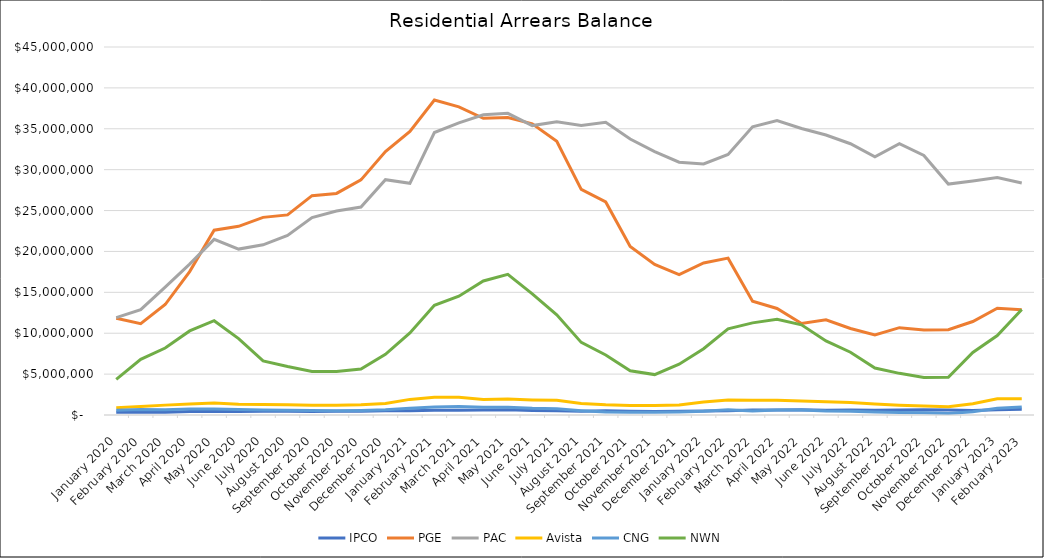
| Category | IPCO | PGE | PAC | Avista | CNG | NWN |
|---|---|---|---|---|---|---|
| 2020-01-01 | 337562.73 | 11838957.17 | 11909155.26 | 879848.87 | 565904.4 | 4357978.69 |
| 2020-02-01 | 337528.44 | 11173217.2 | 12881355.56 | 1038142.59 | 683866.15 | 6813583.27 |
| 2020-03-01 | 330876.65 | 13508473.3 | 15636274.69 | 1207571.92 | 639465.19 | 8187649.74 |
| 2020-04-01 | 433321.73 | 17536868.51 | 18445582.5 | 1353697.84 | 728994.94 | 10279486.32 |
| 2020-05-01 | 427912.47 | 22592714.28 | 21482166.42 | 1473488.31 | 747347.59 | 11531594.11 |
| 2020-06-01 | 424350.82 | 23072727.28 | 20287608.48 | 1306194.43 | 660250.47 | 9339612.07 |
| 2020-07-01 | 446373.22 | 24165486.27 | 20808049.91 | 1276723.46 | 607787.65 | 6608760.62 |
| 2020-08-01 | 465386.07 | 24471510.39 | 21966058.78 | 1261705.11 | 581915.14 | 5926629.56 |
| 2020-09-01 | 425623.22 | 26822587.19 | 24145553.77 | 1205972.31 | 535111.44 | 5334006.03 |
| 2020-10-01 | 456099.22 | 27095085 | 24940097.93 | 1193799.18 | 514156.26 | 5325904 |
| 2020-11-01 | 452357.42 | 28747201.5 | 25432194.26 | 1265923.33 | 547960.08 | 5621064 |
| 2020-12-01 | 517918.66 | 32209037 | 28780009.02 | 1420491.33 | 628119.82 | 7427963 |
| 2021-01-01 | 530895 | 34681355 | 28327691 | 1909801 | 828421.33 | 10041887 |
| 2021-02-01 | 581613.1 | 38511898 | 34540331 | 2178875.24 | 987755.89 | 13405716 |
| 2021-03-01 | 581298.85 | 37677557.84 | 35726549 | 2162970.86 | 1045589.4 | 14521239 |
| 2021-04-01 | 607832.19 | 36275089.64 | 36711900 | 1884001.85 | 940667.18 | 16387073 |
| 2021-05-01 | 629965.35 | 36377956.91 | 36885597 | 1960677.28 | 958391.61 | 17207644.06 |
| 2021-06-01 | 550044.5 | 35612399.2 | 35390227 | 1845402.13 | 819691.93 | 14802084.51 |
| 2021-07-01 | 530674.45 | 33467570.08 | 35850171 | 1794459.05 | 760861.92 | 12247686 |
| 2021-08-01 | 457249.92 | 27581472.27 | 35390227 | 1417441 | 528603.55 | 8880309.4 |
| 2021-09-01 | 511635.83 | 26055224.83 | 35797544 | 1252224.98 | 359737.34 | 7335413 |
| 2021-10-01 | 443397.95 | 20619563.59 | 33745172 | 1155322.59 | 321752.55 | 5412194.47 |
| 2021-11-01 | 423611.13 | 18407242.55 | 32211434 | 1155251.86 | 326552.22 | 4941875.43 |
| 2021-12-01 | 452633.32 | 17168059.35 | 30909094 | 1219719.39 | 365996.72 | 6217029.78 |
| 2022-01-01 | 491219.81 | 18595151.36 | 30705509 | 1583608.09 | 446847.42 | 8100845.4 |
| 2022-02-01 | 517761.49 | 19180906.68 | 31870000 | 1841371.82 | 634035.56 | 10527357.81 |
| 2022-03-01 | 597727.05 | 13907141 | 35237279 | 1801378.36 | 483489.16 | 11264359.83 |
| 2022-04-01 | 597468.01 | 13029195.38 | 36010891 | 1802964.64 | 601124.07 | 11696432.5 |
| 2022-05-01 | 656486.01 | 11194827.51 | 35039986 | 1700730.94 | 607414.05 | 11025304 |
| 2022-06-01 | 581232.38 | 11634290.8 | 34234027 | 1631602.95 | 484712.23 | 9060440.86 |
| 2022-07-01 | 597597.49 | 10583376.49 | 33172591 | 1533886.51 | 456791.49 | 7679758.14 |
| 2022-08-01 | 577914.38 | 9785533.66 | 31568894 | 1358627.93 | 359482.65 | 5750825.85 |
| 2022-09-01 | 601634.88 | 10681257.12 | 33172591 | 1197207.36 | 307660.78 | 5092797.67 |
| 2022-10-01 | 637389.56 | 10409210.89 | 31734883 | 1090820.67 | 268587.53 | 4586231.89 |
| 2022-11-01 | 599540.15 | 10424738.74 | 28241545 | 1018852.47 | 181876.85 | 4624041.62 |
| 2022-12-01 | 551306.07 | 11432255.61 | 28611893 | 1379117.59 | 393091.57 | 7645882.05 |
| 2023-01-01 | 633799.6 | 13056028.26 | 29027200 | 1981111.53 | 831741.42 | 9721066.28 |
| 2023-02-01 | 688923.92 | 12874335.66 | 28367763 | 1984914.13 | 986529.22 | 12910460.73 |